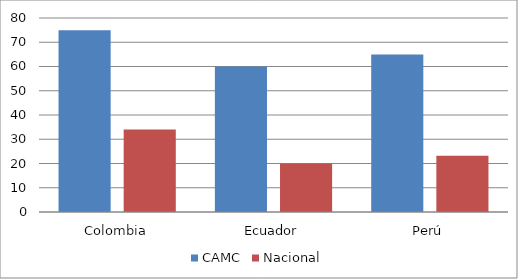
| Category | CAMC | Nacional |
|---|---|---|
| Colombia | 75 | 34 |
| Ecuador | 60 | 20 |
| Perú | 65 | 23.2 |